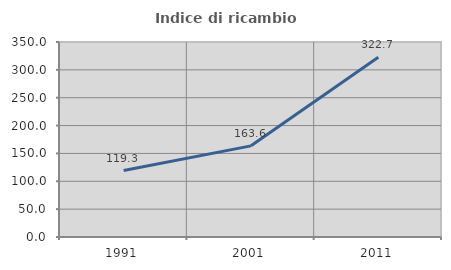
| Category | Indice di ricambio occupazionale  |
|---|---|
| 1991.0 | 119.335 |
| 2001.0 | 163.601 |
| 2011.0 | 322.687 |